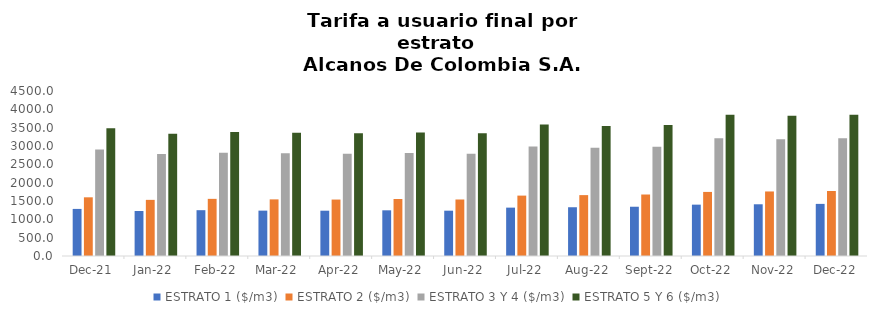
| Category | ESTRATO 1 ($/m3) | ESTRATO 2 ($/m3) | ESTRATO 3 Y 4 ($/m3) | ESTRATO 5 Y 6 ($/m3) |
|---|---|---|---|---|
| 2021-12-01 | 1284.14 | 1600.54 | 2902.39 | 3482.868 |
| 2022-01-01 | 1226.59 | 1530.96 | 2778.76 | 3334.512 |
| 2022-02-01 | 1249.45 | 1558.47 | 2818.77 | 3382.524 |
| 2022-03-01 | 1237.5 | 1544.26 | 2801.57 | 3361.884 |
| 2022-04-01 | 1235.41 | 1539.57 | 2791.83 | 3350.196 |
| 2022-05-01 | 1246.07 | 1555.19 | 2808.77 | 3370.524 |
| 2022-06-01 | 1235.97 | 1541.14 | 2787.21 | 3344.652 |
| 2022-07-01 | 1319.23 | 1647.13 | 2986.65 | 3583.98 |
| 2022-08-01 | 1329.81 | 1660.43 | 2951.9 | 3542.28 |
| 2022-09-01 | 1343.51 | 1677.21 | 2979.32 | 3575.184 |
| 2022-10-01 | 1400.59 | 1747.53 | 3208.12 | 3849.744 |
| 2022-11-01 | 1410.78 | 1760.08 | 3185.9 | 3823.08 |
| 2022-12-01 | 1421.49 | 1773.44 | 3209.93 | 3851.916 |